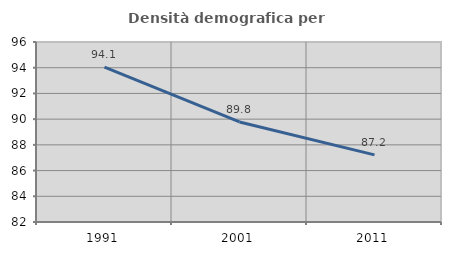
| Category | Densità demografica |
|---|---|
| 1991.0 | 94.051 |
| 2001.0 | 89.784 |
| 2011.0 | 87.224 |